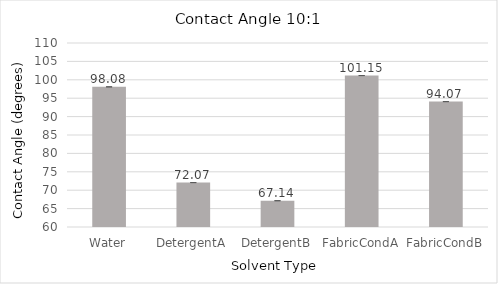
| Category | Series 0 |
|---|---|
| Water | 98.083 |
| DetergentA | 72.07 |
| DetergentB | 67.143 |
| FabricCondA | 101.15 |
| FabricCondB | 94.073 |